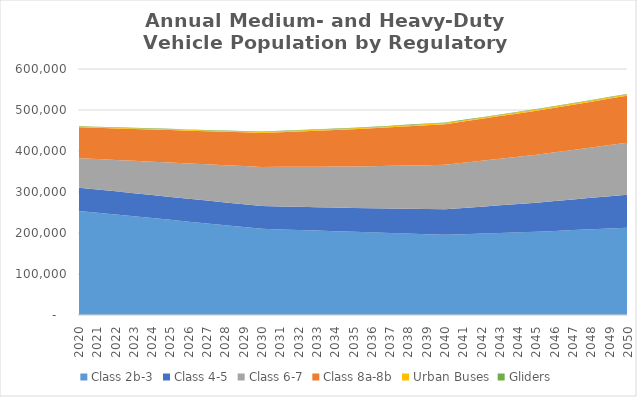
| Category | Class 2b-3 | Class 4-5 | Class 6-7 | Class 8a-8b | Urban Buses | Gliders |
|---|---|---|---|---|---|---|
| 2020.0 | 253890 | 56640 | 71840 | 75540 | 1760 | 1050 |
| 2021.0 | 249530 | 56520 | 74210 | 76280 | 1780 | 1070 |
| 2022.0 | 245160 | 56400 | 76580 | 77020 | 1800 | 1080 |
| 2023.0 | 240800 | 56270 | 78940 | 77760 | 1820 | 1100 |
| 2024.0 | 236430 | 56150 | 81310 | 78500 | 1840 | 1110 |
| 2025.0 | 232070 | 56030 | 83680 | 79240 | 1860 | 1130 |
| 2026.0 | 227710 | 55910 | 86050 | 79980 | 1880 | 1150 |
| 2027.0 | 223340 | 55790 | 88420 | 80720 | 1900 | 1170 |
| 2028.0 | 218980 | 55660 | 90790 | 81450 | 1920 | 1180 |
| 2029.0 | 214610 | 55540 | 93160 | 82190 | 1940 | 1200 |
| 2030.0 | 210250 | 55420 | 95530 | 82930 | 1960 | 1220 |
| 2031.0 | 208820 | 55920 | 96680 | 84520 | 2020 | 1230 |
| 2032.0 | 207400 | 56420 | 97830 | 86110 | 2080 | 1240 |
| 2033.0 | 205970 | 56920 | 98970 | 87710 | 2140 | 1260 |
| 2034.0 | 204550 | 57420 | 100120 | 89300 | 2200 | 1270 |
| 2035.0 | 203120 | 57920 | 101270 | 90890 | 2260 | 1280 |
| 2036.0 | 201640 | 58770 | 102680 | 92570 | 2320 | 1280 |
| 2037.0 | 200160 | 59620 | 104090 | 94260 | 2380 | 1290 |
| 2038.0 | 198680 | 60470 | 105510 | 95940 | 2450 | 1290 |
| 2039.0 | 197200 | 61320 | 106920 | 97630 | 2510 | 1300 |
| 2040.0 | 195720 | 62170 | 108330 | 99310 | 2570 | 1300 |
| 2041.0 | 197200 | 63880 | 110080 | 100880 | 2630 | 1290 |
| 2042.0 | 198680 | 65600 | 111840 | 102440 | 2690 | 1280 |
| 2043.0 | 200160 | 67310 | 113590 | 104010 | 2750 | 1280 |
| 2044.0 | 201640 | 69030 | 115350 | 105570 | 2810 | 1270 |
| 2045.0 | 203120 | 70740 | 117100 | 107140 | 2870 | 1260 |
| 2046.0 | 205100 | 72740 | 118990 | 108680 | 2930 | 1250 |
| 2047.0 | 207080 | 74740 | 120880 | 110220 | 2990 | 1230 |
| 2048.0 | 209070 | 76750 | 122760 | 111760 | 3060 | 1220 |
| 2049.0 | 211050 | 78750 | 124650 | 113300 | 3120 | 1200 |
| 2050.0 | 213030 | 80750 | 126540 | 114840 | 3180 | 1190 |